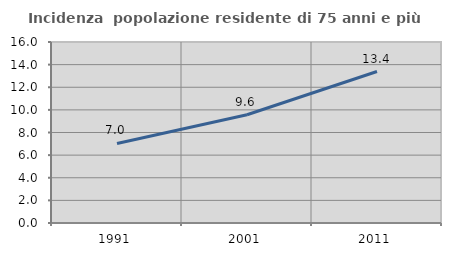
| Category | Incidenza  popolazione residente di 75 anni e più |
|---|---|
| 1991.0 | 7.033 |
| 2001.0 | 9.571 |
| 2011.0 | 13.389 |